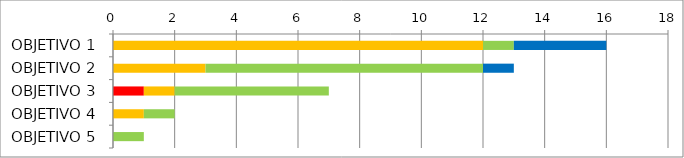
| Category | Series 1 | Series 2 | Series 3 | Series 4 | Series 5 |
|---|---|---|---|---|---|
| OBJETIVO 1 | 0 | 0 | 12 | 1 | 3 |
| OBJETIVO 2 | 0 | 0 | 3 | 9 | 1 |
| OBJETIVO 3 | 0 | 1 | 1 | 5 | 0 |
| OBJETIVO 4 | 0 | 0 | 1 | 1 | 0 |
| OBJETIVO 5 | 0 | 0 | 0 | 1 | 0 |